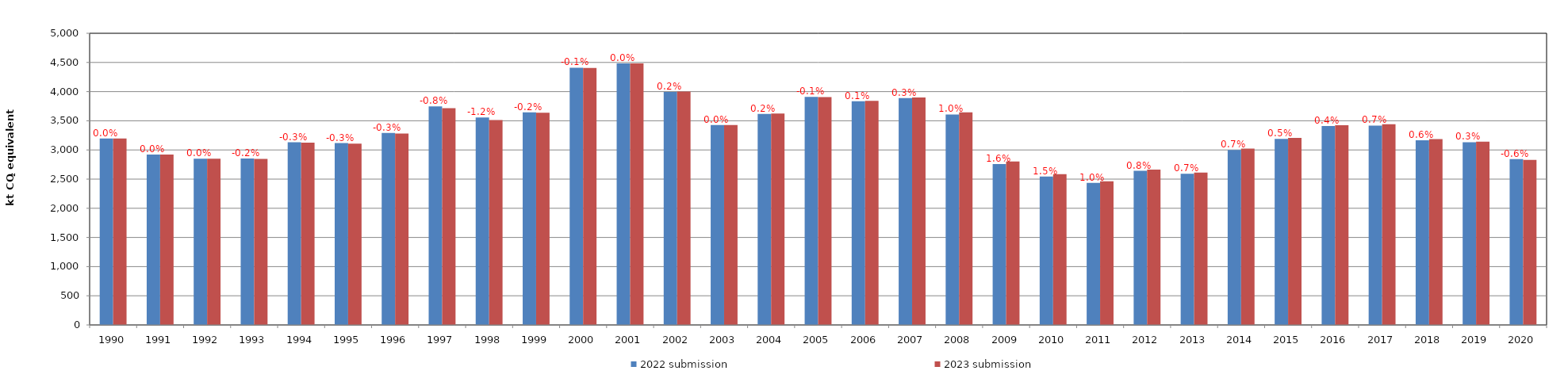
| Category | 2022 submission | 2023 submission |
|---|---|---|
| 1990.0 | 3197.402 | 3197.402 |
| 1991.0 | 2922.598 | 2922.598 |
| 1992.0 | 2848.33 | 2848.33 |
| 1993.0 | 2852.909 | 2846.395 |
| 1994.0 | 3131.638 | 3123.588 |
| 1995.0 | 3117.339 | 3107.744 |
| 1996.0 | 3293.036 | 3282.914 |
| 1997.0 | 3747.996 | 3717.614 |
| 1998.0 | 3555.277 | 3512.179 |
| 1999.0 | 3646.237 | 3639.333 |
| 2000.0 | 4409.449 | 4406.818 |
| 2001.0 | 4484.513 | 4485.058 |
| 2002.0 | 3994.899 | 4002.289 |
| 2003.0 | 3428.356 | 3427.093 |
| 2004.0 | 3617.321 | 3623.786 |
| 2005.0 | 3909.144 | 3905.753 |
| 2006.0 | 3834.676 | 3840.273 |
| 2007.0 | 3889.647 | 3900.622 |
| 2008.0 | 3607.827 | 3645.683 |
| 2009.0 | 2759.692 | 2803.899 |
| 2010.0 | 2545.494 | 2584.611 |
| 2011.0 | 2436.348 | 2461.202 |
| 2012.0 | 2641.866 | 2663.022 |
| 2013.0 | 2593.135 | 2611.719 |
| 2014.0 | 3000.483 | 3021.403 |
| 2015.0 | 3188.881 | 3205.652 |
| 2016.0 | 3410.645 | 3424.739 |
| 2017.0 | 3417.512 | 3442.587 |
| 2018.0 | 3166.777 | 3184.878 |
| 2019.0 | 3131.911 | 3141.656 |
| 2020.0 | 2844.438 | 2828.015 |